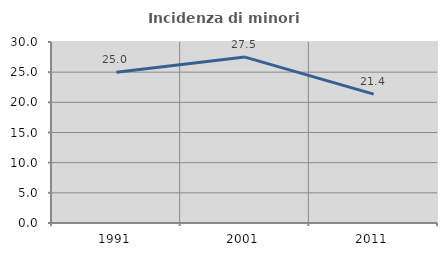
| Category | Incidenza di minori stranieri |
|---|---|
| 1991.0 | 25 |
| 2001.0 | 27.5 |
| 2011.0 | 21.368 |